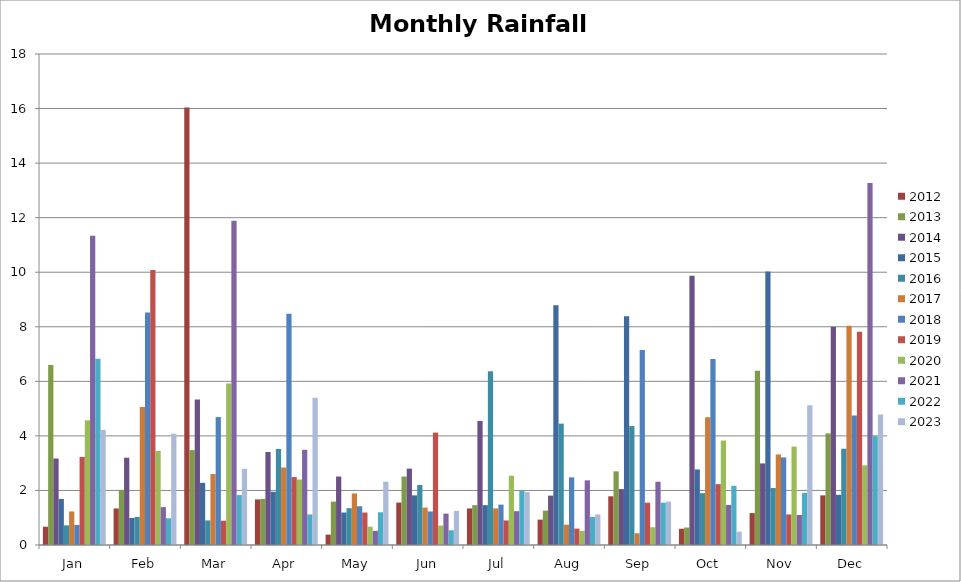
| Category | 2012 | 2013 | 2014 | 2015 | 2016 | 2017 | 2018 | 2019 | 2020 | 2021 | 2022 | 2023 |
|---|---|---|---|---|---|---|---|---|---|---|---|---|
| Jan | 0.67 | 6.6 | 3.17 | 1.69 | 0.72 | 1.23 | 0.735 | 3.23 | 4.57 | 11.34 | 6.83 | 4.22 |
| Feb | 1.34 | 2.02 | 3.2 | 0.99 | 1.03 | 5.06 | 8.525 | 10.08 | 3.45 | 1.39 | 0.98 | 4.08 |
| Mar | 16.04 | 3.48 | 5.33 | 2.28 | 0.9 | 2.6 | 4.69 | 0.89 | 5.92 | 11.89 | 1.83 | 2.79 |
| Apr | 1.67 | 1.69 | 3.41 | 1.95 | 3.52 | 2.84 | 8.48 | 2.49 | 2.4 | 3.49 | 1.12 | 5.4 |
| May | 0.38 | 1.59 | 2.51 | 1.19 | 1.35 | 1.89 | 1.42 | 1.19 | 0.67 | 0.52 | 1.2 | 2.32 |
| Jun | 1.555 | 2.51 | 2.8 | 1.82 | 2.2 | 1.37 | 1.23 | 4.12 | 0.71 | 1.15 | 0.54 | 1.25 |
| Jul | 1.34 | 1.46 | 4.55 | 1.46 | 6.37 | 1.34 | 1.48 | 0.9 | 2.54 | 1.24 | 1.98 | 1.94 |
| Aug | 0.93 | 1.26 | 1.81 | 8.79 | 4.45 | 0.745 | 2.48 | 0.6 | 0.52 | 2.37 | 1.03 | 1.12 |
| Sep | 1.785 | 2.7 | 2.05 | 8.39 | 4.36 | 0.43 | 7.15 | 1.55 | 0.65 | 2.32 | 1.55 | 1.59 |
| Oct | 0.595 | 0.64 | 9.87 | 2.77 | 1.9 | 4.685 | 6.82 | 2.23 | 3.83 | 1.47 | 2.17 | 0.49 |
| Nov | 1.17 | 6.39 | 2.99 | 10.03 | 2.09 | 3.32 | 3.21 | 1.12 | 3.61 | 1.1 | 1.91 | 5.12 |
| Dec | 1.82 | 4.09 | 8 | 1.84 | 3.53 | 8.04 | 4.75 | 7.82 | 2.92 | 13.27 | 3.99 | 4.78 |